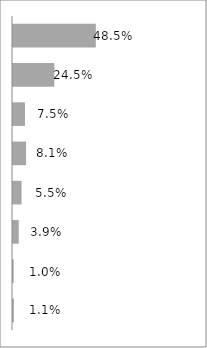
| Category | Series 0 |
|---|---|
| Excel School - Dashboards Membership | 0.485 |
| PM Templates for Excel [2007] | 0.245 |
| Excel School - Download Membership | 0.075 |
| Dashboard Tutorial #1 | 0.081 |
| PM Templates for Excel [both] | 0.055 |
| PM Templates for Excel [2003] | 0.039 |
| Excel School - Online Membership | 0.01 |
| Excel Formula e-book | 0.011 |